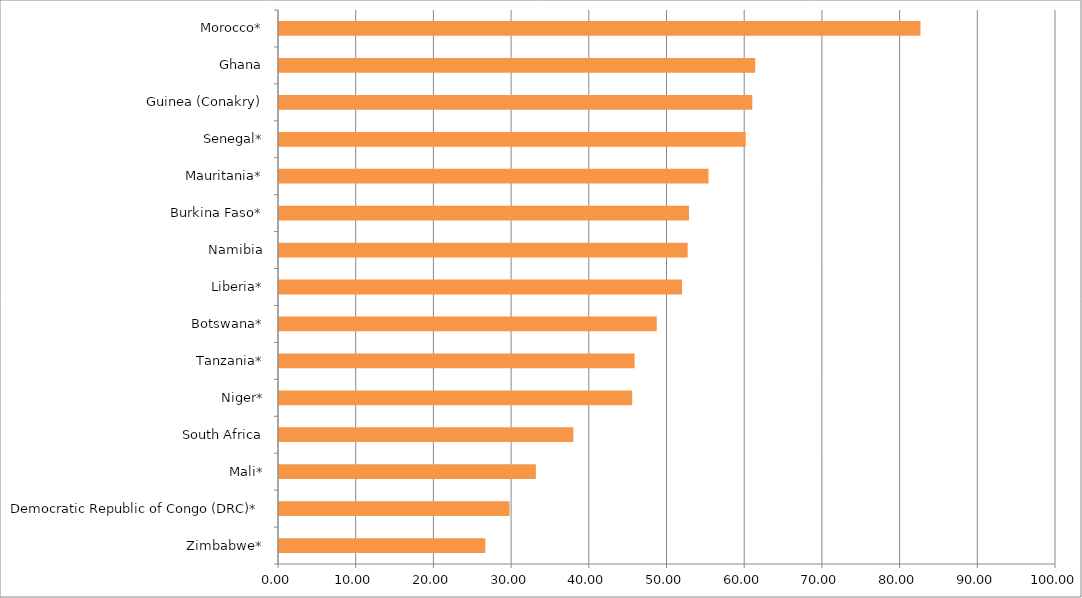
| Category | Series 0 |
|---|---|
| Zimbabwe* | 26.552 |
| Democratic Republic of Congo (DRC)* | 29.672 |
| Mali* | 33.055 |
| South Africa | 37.882 |
| Niger* | 45.46 |
| Tanzania* | 45.764 |
| Botswana* | 48.613 |
| Liberia* | 51.868 |
| Namibia | 52.594 |
| Burkina Faso* | 52.77 |
| Mauritania* | 55.28 |
| Senegal* | 60.067 |
| Guinea (Conakry) | 60.917 |
| Ghana | 61.291 |
| Morocco* | 82.558 |